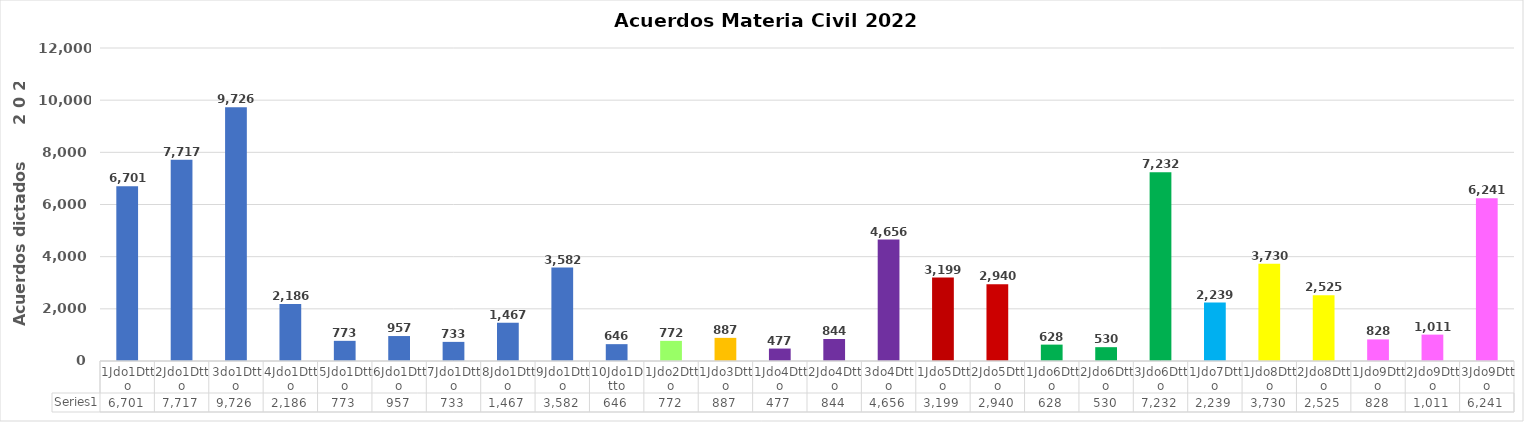
| Category | Series 0 |
|---|---|
| 1Jdo1Dtto | 6701 |
| 2Jdo1Dtto | 7717 |
| 3do1Dtto | 9726 |
| 4Jdo1Dtto | 2186 |
| 5Jdo1Dtto | 773 |
| 6Jdo1Dtto | 957 |
| 7Jdo1Dtto | 733 |
| 8Jdo1Dtto | 1467 |
| 9Jdo1Dtto | 3582 |
| 10Jdo1Dtto | 646 |
| 1Jdo2Dtto | 772 |
| 1Jdo3Dtto | 887 |
| 1Jdo4Dtto | 477 |
| 2Jdo4Dtto | 844 |
| 3do4Dtto | 4656 |
| 1Jdo5Dtto | 3199 |
| 2Jdo5Dtto | 2940 |
| 1Jdo6Dtto | 628 |
| 2Jdo6Dtto | 530 |
| 3Jdo6Dtto | 7232 |
| 1Jdo7Dtto | 2239 |
| 1Jdo8Dtto | 3730 |
| 2Jdo8Dtto | 2525 |
| 1Jdo9Dtto | 828 |
| 2Jdo9Dtto | 1011 |
| 3Jdo9Dtto | 6241 |